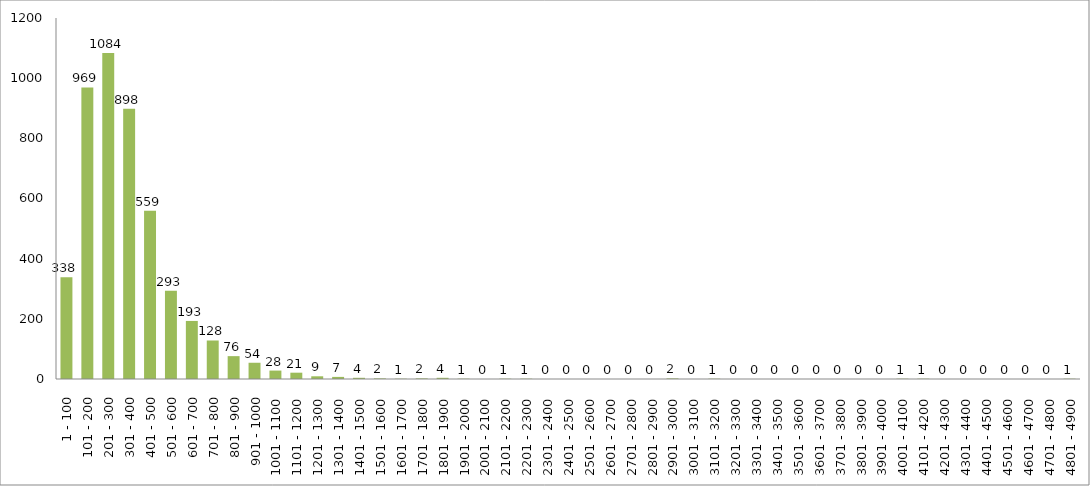
| Category | Series 0 |
|---|---|
| 1 - 100 | 338 |
| 101 - 200 | 969 |
| 201 - 300 | 1084 |
| 301 - 400 | 898 |
| 401 - 500 | 559 |
| 501 - 600 | 293 |
| 601 - 700 | 193 |
| 701 - 800 | 128 |
| 801 - 900 | 76 |
| 901 - 1000 | 54 |
| 1001 - 1100 | 28 |
| 1101 - 1200 | 21 |
| 1201 - 1300 | 9 |
| 1301 - 1400 | 7 |
| 1401 - 1500 | 4 |
| 1501 - 1600 | 2 |
| 1601 - 1700 | 1 |
| 1701 - 1800 | 2 |
| 1801 - 1900 | 4 |
| 1901 - 2000 | 1 |
| 2001 - 2100 | 0 |
| 2101 - 2200 | 1 |
| 2201 - 2300 | 1 |
| 2301 - 2400 | 0 |
| 2401 - 2500 | 0 |
| 2501 - 2600 | 0 |
| 2601 - 2700 | 0 |
| 2701 - 2800 | 0 |
| 2801 - 2900 | 0 |
| 2901 - 3000 | 2 |
| 3001 - 3100 | 0 |
| 3101 - 3200 | 1 |
| 3201 - 3300 | 0 |
| 3301 - 3400 | 0 |
| 3401 - 3500 | 0 |
| 3501 - 3600 | 0 |
| 3601 - 3700 | 0 |
| 3701 - 3800 | 0 |
| 3801 - 3900 | 0 |
| 3901 - 4000 | 0 |
| 4001 - 4100 | 1 |
| 4101 - 4200 | 1 |
| 4201 - 4300 | 0 |
| 4301 - 4400 | 0 |
| 4401 - 4500 | 0 |
| 4501 - 4600 | 0 |
| 4601 - 4700 | 0 |
| 4701 - 4800 | 0 |
| 4801 - 4900 | 1 |